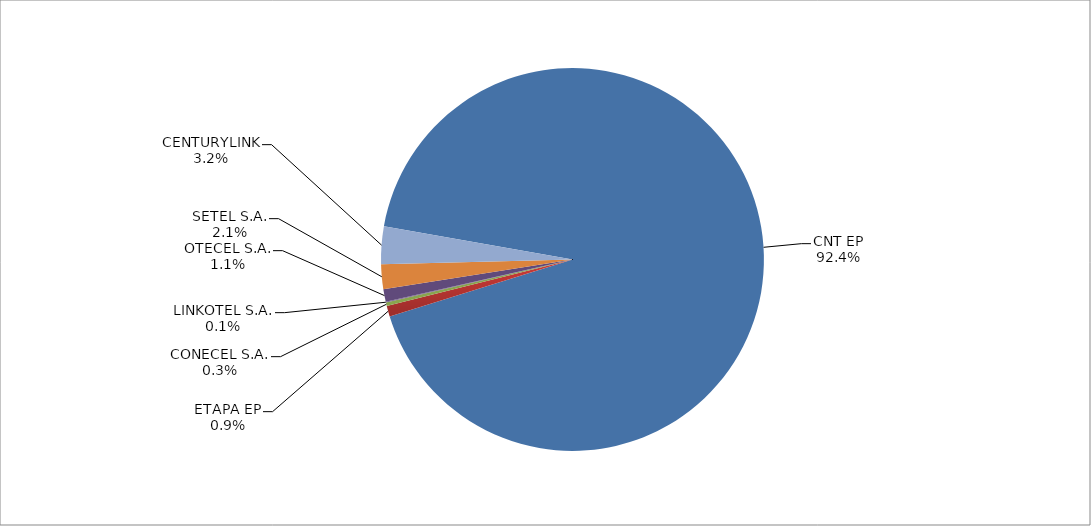
| Category | Series 0 |
|---|---|
| CNT EP | 2863 |
| ETAPA EP | 28 |
| CONECEL S.A. | 9 |
| LINKOTEL S.A. | 2 |
| OTECEL S.A. | 33 |
| SETEL S.A. | 65 |
| CENTURYLINK | 98 |